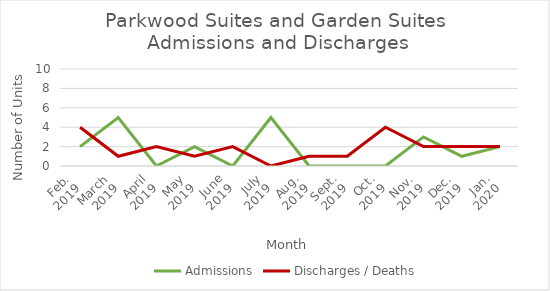
| Category | Admissions | Discharges / Deaths |
|---|---|---|
| Feb.
2019 | 2 | 4 |
| March
2019 | 5 | 1 |
| April
2019 | 0 | 2 |
| May
2019 | 2 | 1 |
| June
2019 | 0 | 2 |
| July
2019 | 5 | 0 |
| Aug.
2019 | 0 | 1 |
| Sept.
2019 | 0 | 1 |
| Oct.
2019 | 0 | 4 |
| Nov.
2019 | 3 | 2 |
| Dec.
2019 | 1 | 2 |
| Jan.
2020 | 2 | 2 |